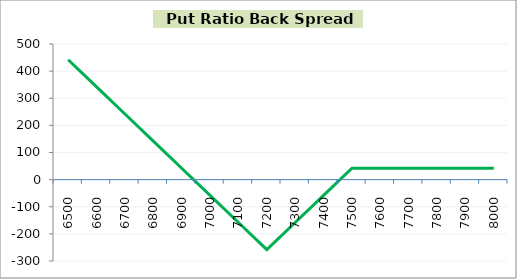
| Category | Series 1 |
|---|---|
| 6500.0 | 442 |
| 6600.0 | 342 |
| 6700.0 | 242 |
| 6800.0 | 142 |
| 6900.0 | 42 |
| 7000.0 | -58 |
| 7100.0 | -158 |
| 7200.0 | -258 |
| 7300.0 | -158 |
| 7400.0 | -58 |
| 7500.0 | 42 |
| 7600.0 | 42 |
| 7700.0 | 42 |
| 7800.0 | 42 |
| 7900.0 | 42 |
| 8000.0 | 42 |